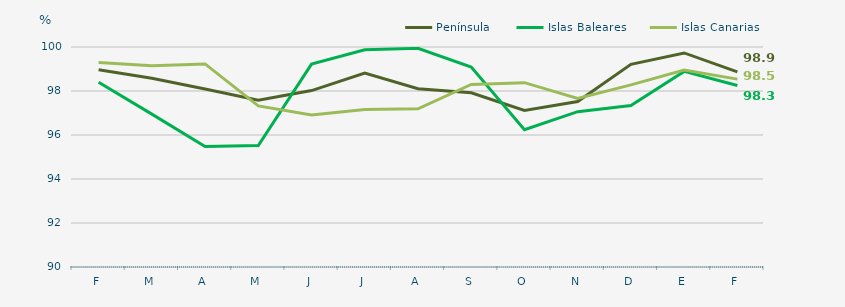
| Category | Península | Islas Baleares | Islas Canarias |
|---|---|---|---|
| F | 98.97 | 98.4 | 99.29 |
| M | 98.58 | 96.95 | 99.15 |
| A | 98.09 | 95.48 | 99.23 |
| M | 97.58 | 95.52 | 97.32 |
| J | 98.02 | 99.22 | 96.91 |
| J | 98.81 | 99.87 | 97.16 |
| A | 98.1 | 99.94 | 97.19 |
| S | 97.92 | 99.09 | 98.3 |
| O | 97.12 | 96.24 | 98.38 |
| N | 97.52 | 97.06 | 97.66 |
| D | 99.21 | 97.34 | 98.28 |
| E | 99.73 | 98.89 | 98.95 |
| F | 98.87 | 98.25 | 98.54 |